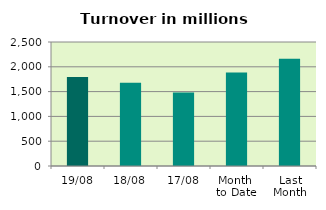
| Category | Series 0 |
|---|---|
| 19/08 | 1793.54 |
| 18/08 | 1677.602 |
| 17/08 | 1481.204 |
| Month 
to Date | 1886.326 |
| Last
Month | 2162.227 |